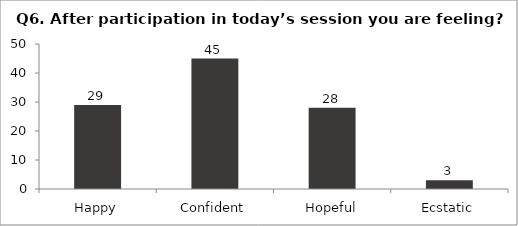
| Category | Q6. After participation in today’s session you are feeling? |
|---|---|
| Happy | 29 |
| Confident | 45 |
| Hopeful | 28 |
| Ecstatic | 3 |